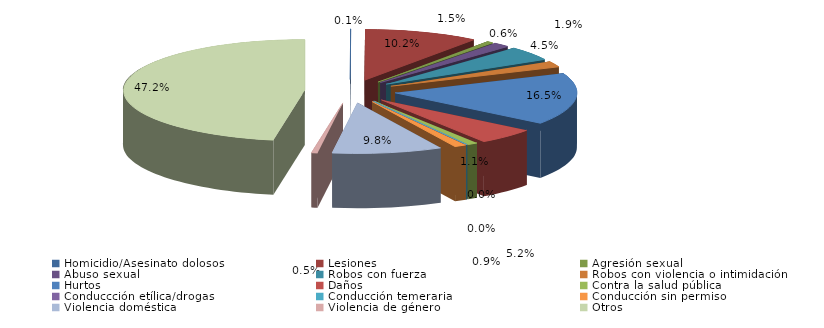
| Category | Series 0 |
|---|---|
| Homicidio/Asesinato dolosos | 1 |
| Lesiones | 190 |
| Agresión sexual | 11 |
| Abuso sexual | 28 |
| Robos con fuerza | 84 |
| Robos con violencia o intimidación | 35 |
| Hurtos | 308 |
| Daños | 97 |
| Contra la salud pública | 17 |
| Conduccción etílica/drogas | 0 |
| Conducción temeraria | 0 |
| Conducción sin permiso | 20 |
| Violencia doméstica | 182 |
| Violencia de género | 10 |
| Otros | 880 |